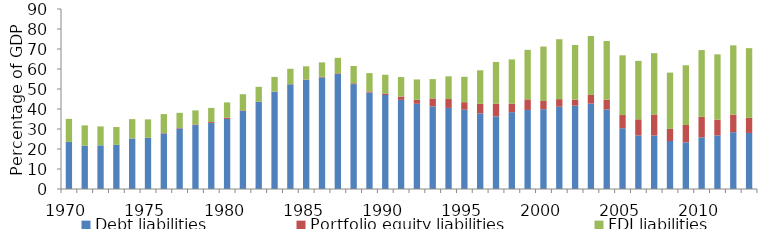
| Category | Debt liabilities | Portfolio equity liabilities | FDI liabilities |
|---|---|---|---|
| 1970.0 | 23.548 | 0 | 11.509 |
| 1971.0 | 21.688 | 0 | 10.11 |
| 1972.0 | 21.833 | 0 | 9.445 |
| 1973.0 | 22.072 | 0 | 8.913 |
| 1974.0 | 25.26 | 0 | 9.685 |
| 1975.0 | 25.595 | 0 | 9.218 |
| 1976.0 | 27.758 | 0.197 | 9.497 |
| 1977.0 | 30.262 | 0.224 | 7.6 |
| 1978.0 | 31.968 | 0.298 | 7.033 |
| 1979.0 | 32.974 | 0.482 | 7.092 |
| 1980.0 | 35.03 | 0.564 | 7.691 |
| 1981.0 | 38.996 | 0.301 | 8.102 |
| 1982.0 | 43.5 | 0.121 | 7.478 |
| 1983.0 | 48.547 | 0.122 | 7.386 |
| 1984.0 | 52.33 | 0.114 | 7.653 |
| 1985.0 | 54.569 | 0.153 | 6.62 |
| 1986.0 | 55.768 | 0.284 | 7.25 |
| 1987.0 | 57.548 | 0.298 | 7.73 |
| 1988.0 | 52.464 | 0.393 | 8.646 |
| 1989.0 | 48.222 | 0.564 | 9.161 |
| 1990.0 | 46.998 | 0.779 | 9.347 |
| 1991.0 | 44.557 | 1.67 | 9.752 |
| 1992.0 | 42.601 | 1.998 | 10.168 |
| 1993.0 | 41.313 | 3.957 | 9.668 |
| 1994.0 | 40.547 | 4.439 | 11.365 |
| 1995.0 | 39.642 | 3.758 | 12.687 |
| 1996.0 | 37.813 | 4.755 | 16.775 |
| 1997.0 | 36.318 | 6.409 | 20.799 |
| 1998.0 | 38.424 | 4.183 | 22.193 |
| 1999.0 | 39.531 | 5.302 | 24.736 |
| 2000.0 | 39.907 | 4.104 | 27.217 |
| 2001.0 | 41.135 | 3.795 | 29.956 |
| 2002.0 | 41.663 | 3.037 | 27.283 |
| 2003.0 | 42.693 | 4.35 | 29.465 |
| 2004.0 | 39.764 | 4.951 | 29.274 |
| 2005.0 | 30.388 | 6.591 | 29.868 |
| 2006.0 | 26.792 | 8.057 | 29.212 |
| 2007.0 | 26.733 | 10.549 | 30.66 |
| 2008.0 | 24.009 | 6.034 | 28.16 |
| 2009.0 | 23.327 | 8.66 | 29.891 |
| 2010.0 | 25.789 | 10.287 | 33.373 |
| 2011.0 | 26.794 | 7.904 | 32.635 |
| 2012.0 | 28.419 | 8.769 | 34.628 |
| 2013.0 | 28.014 | 7.55 | 34.87 |